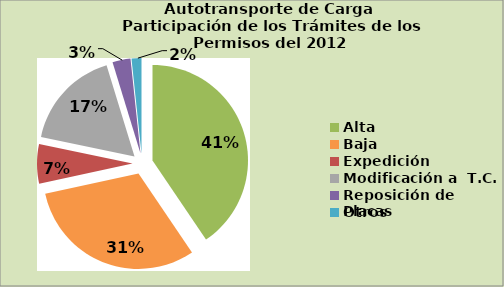
| Category | Series 0 |
|---|---|
| Alta                                         | 40.539 |
| Baja | 31.051 |
| Expedición | 6.699 |
| Modificación a  T.C. | 16.984 |
| Reposición de Placas | 3.052 |
| Otros | 1.675 |